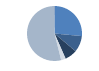
| Category | Series 0 |
|---|---|
| ARRASTRE | 413 |
| CERCO | 150 |
| PALANGRE | 113 |
| REDES DE ENMALLE | 42 |
| ARTES MENORES | 835 |
| SIN TIPO ASIGNADO | 5 |